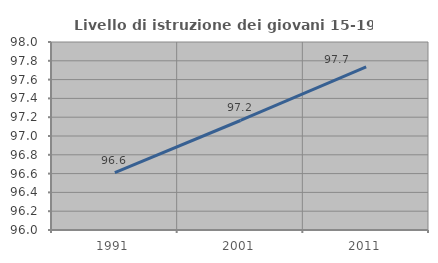
| Category | Livello di istruzione dei giovani 15-19 anni |
|---|---|
| 1991.0 | 96.61 |
| 2001.0 | 97.165 |
| 2011.0 | 97.737 |